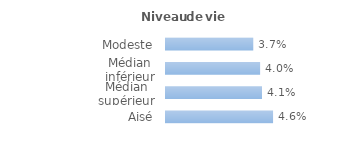
| Category | Series 0 |
|---|---|
| Modeste | 0.037 |
| Médian inférieur | 0.04 |
| Médian supérieur | 0.041 |
| Aisé | 0.046 |